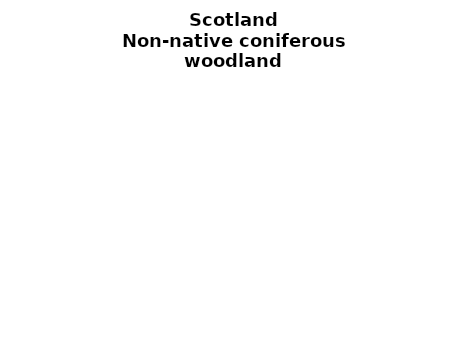
| Category | Non-native coniferous woodland |
|---|---|
|  ≥ 10ha, < 10%  | 0.478 |
|   ≥ 10ha, 10-25% | 0.198 |
|   ≥ 10ha, > 25 and <50%  | 0.127 |
|   ≥ 10ha, ≥ 50%  | 0.156 |
|  < 10ha, < 10% | 0.007 |
|  < 10ha, 10-25% | 0.007 |
|  < 10ha, > 25 and < 50% | 0.01 |
|  < 10ha, ≥ 50% | 0.018 |